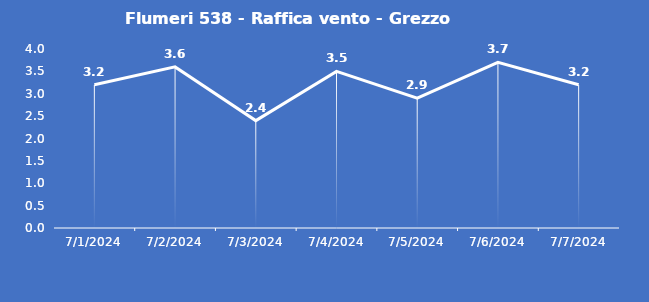
| Category | Flumeri 538 - Raffica vento - Grezzo (m/s) |
|---|---|
| 7/1/24 | 3.2 |
| 7/2/24 | 3.6 |
| 7/3/24 | 2.4 |
| 7/4/24 | 3.5 |
| 7/5/24 | 2.9 |
| 7/6/24 | 3.7 |
| 7/7/24 | 3.2 |